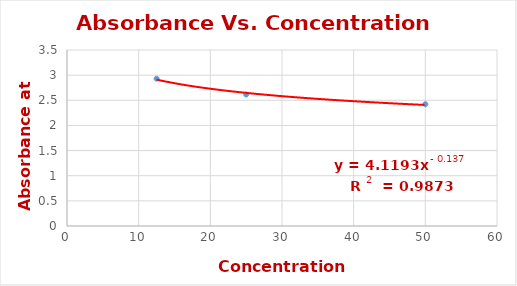
| Category | Series 0 |
|---|---|
| 50.0 | 2.422 |
| 25.0 | 2.614 |
| 12.5 | 2.93 |